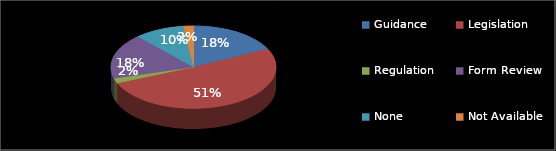
| Category | Series 0 |
|---|---|
| Guidance | 9 |
| Legislation | 26 |
| Regulation | 1 |
| Form Review | 9 |
| None | 5 |
| Not Available | 1 |